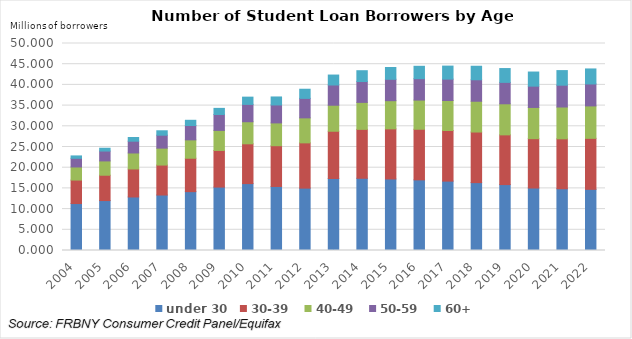
| Category | under 30 | 30-39 | 40-49 | 50-59 | 60+ |
|---|---|---|---|---|---|
| 2004.0 | 11.343 | 5.672 | 3.162 | 2.091 | 0.577 |
| 2005.0 | 12.062 | 6.12 | 3.454 | 2.385 | 0.68 |
| 2006.0 | 12.928 | 6.765 | 3.865 | 2.842 | 0.893 |
| 2007.0 | 13.401 | 7.235 | 4.089 | 3.125 | 1.069 |
| 2008.0 | 14.217 | 8.066 | 4.44 | 3.464 | 1.264 |
| 2009.0 | 15.317 | 8.846 | 4.843 | 3.846 | 1.478 |
| 2010.0 | 16.161 | 9.608 | 5.332 | 4.191 | 1.75 |
| 2011.0 | 15.466 | 9.848 | 5.505 | 4.337 | 1.931 |
| 2012.0 | 15.066 | 10.933 | 6.038 | 4.703 | 2.213 |
| 2013.0 | 17.39 | 11.414 | 6.284 | 4.889 | 2.403 |
| 2014.0 | 17.446 | 11.816 | 6.516 | 5.033 | 2.617 |
| 2015.0 | 17.279 | 12.098 | 6.81 | 5.168 | 2.849 |
| 2016.0 | 17.059 | 12.228 | 7.048 | 5.166 | 2.993 |
| 2017.0 | 16.759 | 12.233 | 7.242 | 5.16 | 3.146 |
| 2018.0 | 16.397 | 12.218 | 7.435 | 5.19 | 3.265 |
| 2019.0 | 15.924 | 12.006 | 7.509 | 5.171 | 3.339 |
| 2020.0 | 15.091 | 11.922 | 7.54 | 5.147 | 3.408 |
| 2021.0 | 14.914 | 12.061 | 7.686 | 5.268 | 3.527 |
| 2022.0 | 14.775 | 12.316 | 7.833 | 5.304 | 3.626 |